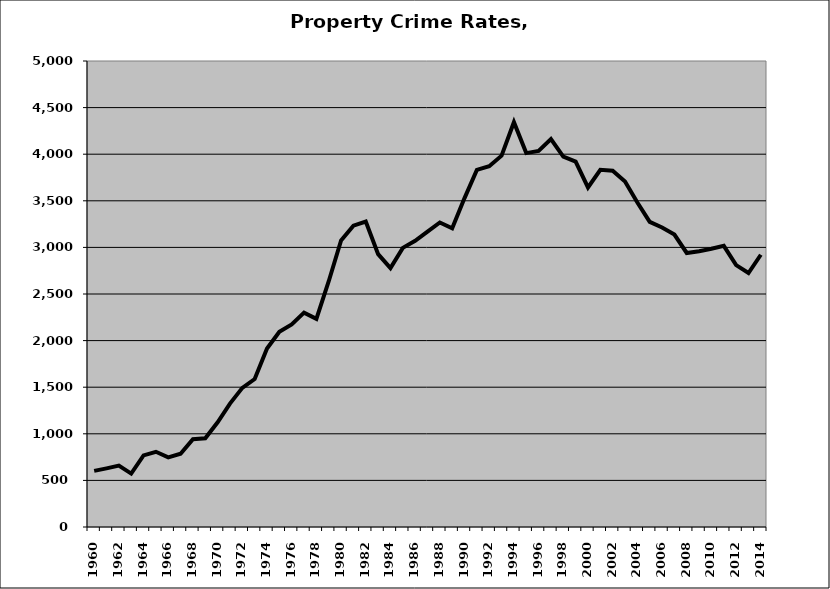
| Category | Property |
|---|---|
| 1960.0 | 602.027 |
| 1961.0 | 629.436 |
| 1962.0 | 659.698 |
| 1963.0 | 573.144 |
| 1964.0 | 768.626 |
| 1965.0 | 807.066 |
| 1966.0 | 746.627 |
| 1967.0 | 786.371 |
| 1968.0 | 942.186 |
| 1969.0 | 952.645 |
| 1970.0 | 1123.094 |
| 1971.0 | 1324.169 |
| 1972.0 | 1492.62 |
| 1973.0 | 1587.242 |
| 1974.0 | 1914.329 |
| 1975.0 | 2094.842 |
| 1976.0 | 2172.897 |
| 1977.0 | 2299.916 |
| 1978.0 | 2233.694 |
| 1979.0 | 2637.032 |
| 1980.0 | 3075.225 |
| 1981.0 | 3232.767 |
| 1982.0 | 3278.009 |
| 1983.0 | 2927.716 |
| 1984.0 | 2777.868 |
| 1985.0 | 2994.795 |
| 1986.0 | 3070.933 |
| 1987.0 | 3168.838 |
| 1988.0 | 3267.606 |
| 1989.0 | 3204.121 |
| 1990.0 | 3528.775 |
| 1991.0 | 3831.674 |
| 1992.0 | 3870.735 |
| 1993.0 | 3984.412 |
| 1994.0 | 4343.35 |
| 1995.0 | 4011.68 |
| 1996.0 | 4034.647 |
| 1997.0 | 4161.26 |
| 1998.0 | 3973.292 |
| 1999.0 | 3921.088 |
| 2000.0 | 3643.461 |
| 2001.0 | 3832.84 |
| 2002.0 | 3822.609 |
| 2003.0 | 3707.321 |
| 2004.0 | 3481.147 |
| 2005.0 | 3274.235 |
| 2006.0 | 3213.012 |
| 2007.0 | 3137.778 |
| 2008.0 | 2940.094 |
| 2009.0 | 2958.236 |
| 2010.0 | 2985.006 |
| 2011.0 | 3016.299 |
| 2012.0 | 2810.461 |
| 2013.0 | 2725.347 |
| 2014.0 | 2921.165 |